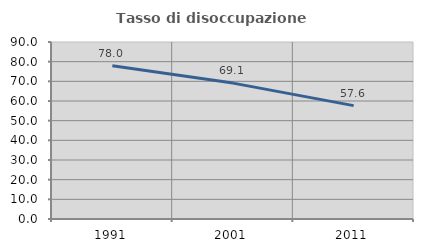
| Category | Tasso di disoccupazione giovanile  |
|---|---|
| 1991.0 | 77.962 |
| 2001.0 | 69.101 |
| 2011.0 | 57.639 |